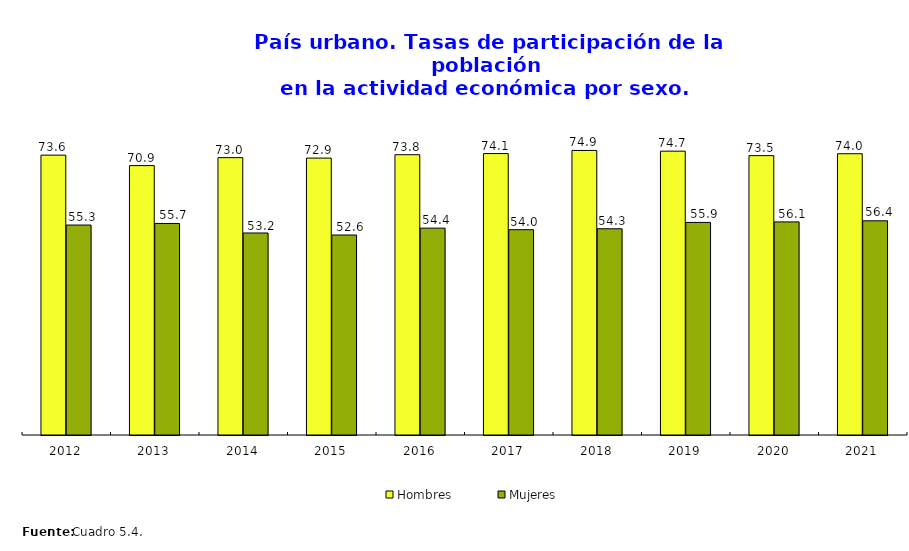
| Category | Hombres | Mujeres |
|---|---|---|
| 2012.0 | 73.649 | 55.252 |
| 2013.0 | 70.893 | 55.669 |
| 2014.0 | 72.993 | 53.161 |
| 2015.0 | 72.87 | 52.626 |
| 2016.0 | 73.762 | 54.434 |
| 2017.0 | 74.063 | 54.027 |
| 2018.0 | 74.883 | 54.269 |
| 2019.0 | 74.695 | 55.939 |
| 2020.0 | 73.519 | 56.078 |
| 2021.0 | 74.018 | 56.365 |